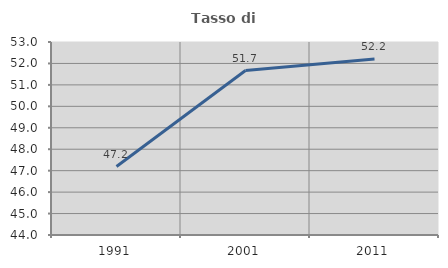
| Category | Tasso di occupazione   |
|---|---|
| 1991.0 | 47.191 |
| 2001.0 | 51.668 |
| 2011.0 | 52.205 |